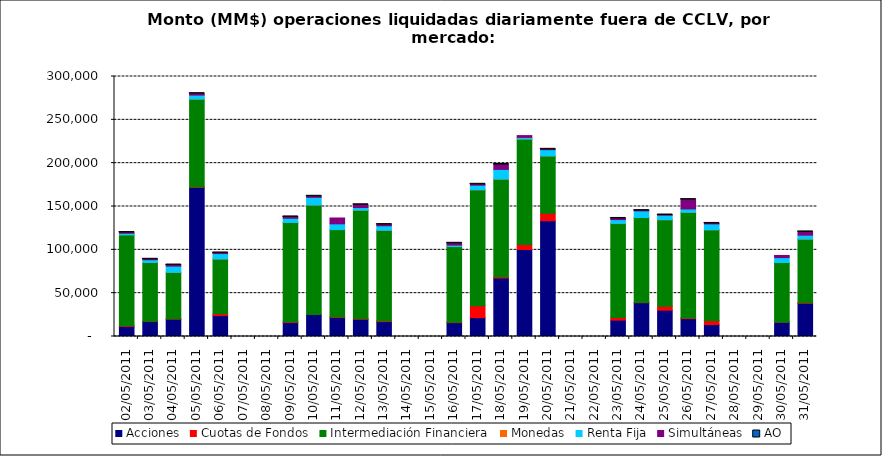
| Category | Acciones | Cuotas de Fondos | Intermediación Financiera | Monedas | Renta Fija | Simultáneas | AO |
|---|---|---|---|---|---|---|---|
| 02/05/2011 | 11668.556 | 641.291 | 105029.004 | 29.641 | 1791.007 | 768.517 | 0.728 |
| 03/05/2011 | 17299.079 | 208.564 | 67966.058 | 14.606 | 3084.022 | 492.552 | 0.296 |
| 04/05/2011 | 20039.525 | 278.32 | 53704.749 | 9.69 | 7177.594 | 1224.721 | 0.293 |
| 05/05/2011 | 171951.89 | 591.198 | 101431.451 | 18.977 | 4544.276 | 1616.984 | 0.043 |
| 06/05/2011 | 24109.841 | 2010.21 | 63368.788 | 5.15 | 6207.323 | 675.066 | 0.01 |
| 09/05/2011 | 16012.704 | 691.3 | 114864.693 | 17.408 | 4831.797 | 1527.171 | 0.586 |
| 10/05/2011 | 25435.105 | 92.772 | 126260.192 | 12.321 | 8761.968 | 1199.66 | 0.03 |
| 11/05/2011 | 21825.355 | 642.705 | 100922.276 | 14.145 | 6594.583 | 6745.212 | 0 |
| 12/05/2011 | 19895.654 | 613.245 | 125323.961 | 11.209 | 2898.592 | 3212.816 | 0.01 |
| 13/05/2011 | 17136.651 | 885.654 | 104621.002 | 9.187 | 5078.817 | 1390.972 | 0.163 |
| 16/05/2011 | 15940.818 | 512.149 | 87340.95 | 4.368 | 1633.002 | 2099.075 | 0.027 |
| 17/05/2011 | 21720.23 | 13710.85 | 133881.343 | 8.325 | 5312.169 | 963.047 | 0.046 |
| 18/05/2011 | 67521.486 | 1133.402 | 113017.733 | 26.085 | 11109.686 | 5631.447 | 0.514 |
| 19/05/2011 | 100380.67 | 5740.184 | 121794.647 | 16.8 | 1801.466 | 2085.944 | 0 |
| 20/05/2011 | 133618.083 | 8588.021 | 66190.344 | 16.573 | 7163.822 | 381.953 | 0.021 |
| 23/05/2011 | 18928.065 | 3099.81 | 108482.701 | 15.12 | 4341.626 | 1330.148 | 0.119 |
| 24/05/2011 | 38923.398 | 392.085 | 97946.769 | 43.918 | 7623.73 | 301.528 | 0.278 |
| 25/05/2011 | 30382.053 | 4608.144 | 99781.9 | 42.333 | 5165.42 | 164.942 | 0.023 |
| 26/05/2011 | 20559.211 | 887.11 | 121883.513 | 22.12 | 3835.399 | 10737.024 | 0.246 |
| 27/05/2011 | 13868.953 | 4401.234 | 104875.187 | 10.264 | 6758.064 | 530.402 | 0.197 |
| 30/05/2011 | 16359.377 | 197.376 | 68801.646 | 46.885 | 5603.476 | 2519.673 | 0 |
| 31/05/2011 | 38280.927 | 602.025 | 73554.716 | 25.285 | 4485.209 | 3709.622 | 0.01 |